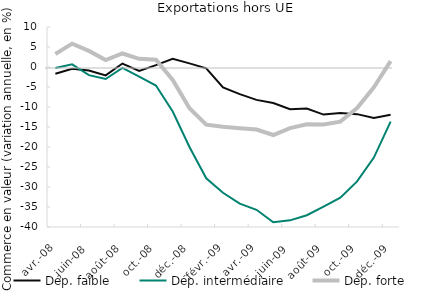
| Category | Dép. faible | Dép. intermédiaire | Dép. forte |
|---|---|---|---|
| 2008-04-01 | -1.678 | -0.229 | 3.248 |
| 2008-05-01 | -0.459 | 0.676 | 5.835 |
| 2008-06-01 | -0.86 | -2.047 | 4.023 |
| 2008-07-01 | -2.106 | -2.998 | 1.719 |
| 2008-08-01 | 0.861 | -0.237 | 3.382 |
| 2008-09-01 | -0.977 | -2.389 | 2.037 |
| 2008-10-01 | 0.455 | -4.628 | 1.803 |
| 2008-11-01 | 2.049 | -11.117 | -3.215 |
| 2008-12-01 | 0.906 | -19.993 | -10.319 |
| 2009-01-01 | -0.329 | -27.823 | -14.428 |
| 2009-02-01 | -5.119 | -31.439 | -14.957 |
| 2009-03-01 | -6.784 | -34.141 | -15.333 |
| 2009-04-01 | -8.22 | -35.701 | -15.642 |
| 2009-05-01 | -9.003 | -38.796 | -17.002 |
| 2009-06-01 | -10.551 | -38.333 | -15.265 |
| 2009-07-01 | -10.383 | -37.06 | -14.316 |
| 2009-08-01 | -11.897 | -34.909 | -14.347 |
| 2009-09-01 | -11.509 | -32.682 | -13.658 |
| 2009-10-01 | -11.787 | -28.609 | -10.274 |
| 2009-11-01 | -12.76 | -22.644 | -5.057 |
| 2009-12-01 | -11.941 | -13.65 | 1.468 |